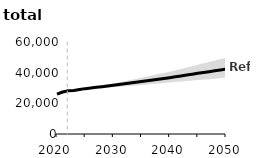
| Category | Ref |
|---|---|
| 2020.0 | 25961.39 |
| 2021.0 | 27364.337 |
| 2022.0 | 28238.86 |
| 2023.0 | 28397.191 |
| 2024.0 | 29065.234 |
| 2025.0 | 29584.156 |
| 2026.0 | 30016.977 |
| 2027.0 | 30445.013 |
| 2028.0 | 30879.487 |
| 2029.0 | 31313.966 |
| 2030.0 | 31739.139 |
| 2031.0 | 32227.316 |
| 2032.0 | 32721.209 |
| 2033.0 | 33206.898 |
| 2034.0 | 33697.958 |
| 2035.0 | 34190.663 |
| 2036.0 | 34704.249 |
| 2037.0 | 35215.135 |
| 2038.0 | 35725.556 |
| 2039.0 | 36232.998 |
| 2040.0 | 36744.277 |
| 2041.0 | 37309.578 |
| 2042.0 | 37876.565 |
| 2043.0 | 38444.83 |
| 2044.0 | 39013.08 |
| 2045.0 | 39586.638 |
| 2046.0 | 40124.784 |
| 2047.0 | 40666.518 |
| 2048.0 | 41207.22 |
| 2049.0 | 41749.023 |
| 2050.0 | 42297.838 |